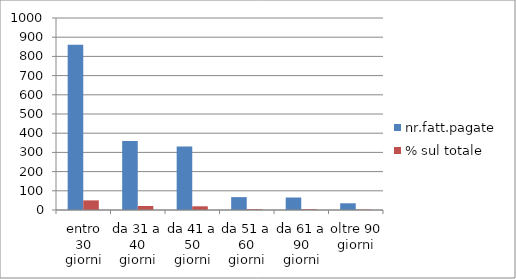
| Category | nr.fatt.pagate | % sul totale |
|---|---|---|
| entro 30 giorni | 861 | 50.116 |
| da 31 a 40 giorni | 359 | 20.896 |
| da 41 a 50 giorni | 331 | 19.267 |
| da 51 a 60 giorni | 67 | 3.9 |
| da 61 a 90 giorni | 65 | 3.783 |
| oltre 90 giorni | 35 | 2.037 |